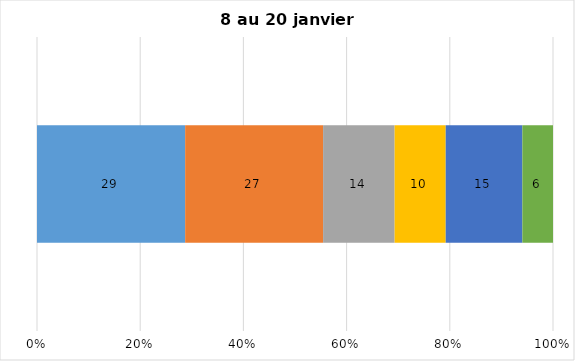
| Category | Plusieurs fois par jour | Une fois par jour | Quelques fois par semaine   | Une fois par semaine ou moins   |  Jamais   |  Je n’utilise pas les médias sociaux |
|---|---|---|---|---|---|---|
| 0 | 29 | 27 | 14 | 10 | 15 | 6 |